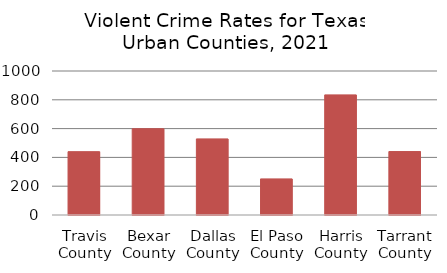
| Category | Series 0 |
|---|---|
| Travis County | 439.802 |
| Bexar County | 598.851 |
| Dallas County | 528.442 |
| El Paso County | 250.735 |
| Harris County | 834.173 |
| Tarrant County | 440.604 |